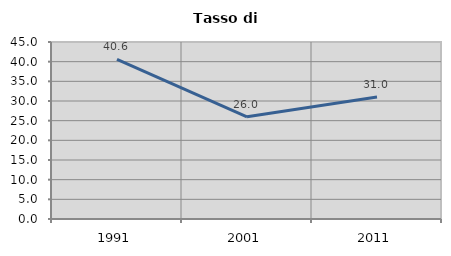
| Category | Tasso di disoccupazione   |
|---|---|
| 1991.0 | 40.553 |
| 2001.0 | 25.989 |
| 2011.0 | 31.004 |